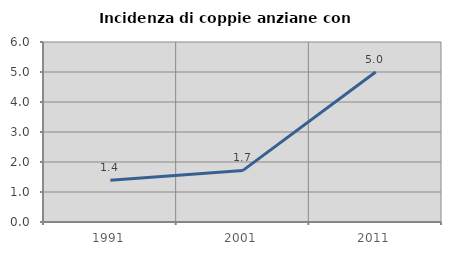
| Category | Incidenza di coppie anziane con figli |
|---|---|
| 1991.0 | 1.392 |
| 2001.0 | 1.72 |
| 2011.0 | 5 |